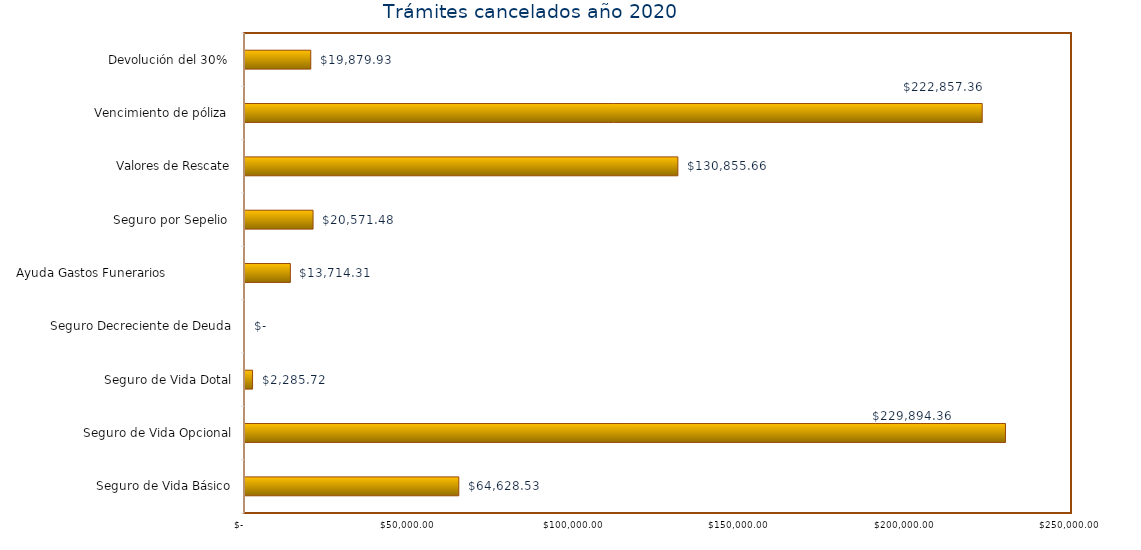
| Category | Monto  |
|---|---|
| Seguro de Vida Básico | 64628.53 |
| Seguro de Vida Opcional | 229894.36 |
| Seguro de Vida Dotal | 2285.72 |
| Seguro Decreciente de Deuda | 0 |
| Ayuda Gastos Funerarios                  | 13714.31 |
| Seguro por Sepelio  | 20571.48 |
| Valores de Rescate | 130855.66 |
| Vencimiento de póliza  | 222857.36 |
| Devolución del 30%  | 19879.93 |